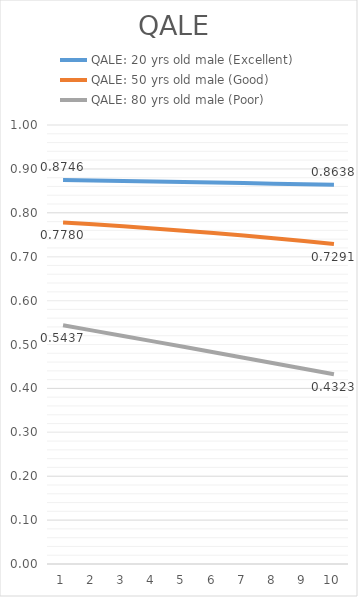
| Category | QALE: 20 yrs old male (Excellent) | QALE: 50 yrs old male (Good) | QALE: 80 yrs old male (Poor) |
|---|---|---|---|
| 1.0 | 0.875 | 0.778 | 0.544 |
| 2.0 | 0.874 | 0.774 | 0.532 |
| 3.0 | 0.872 | 0.769 | 0.519 |
| 4.0 | 0.871 | 0.764 | 0.507 |
| 5.0 | 0.87 | 0.759 | 0.495 |
| 6.0 | 0.869 | 0.754 | 0.482 |
| 7.0 | 0.868 | 0.748 | 0.47 |
| 8.0 | 0.866 | 0.742 | 0.457 |
| 9.0 | 0.865 | 0.736 | 0.445 |
| 10.0 | 0.864 | 0.729 | 0.432 |